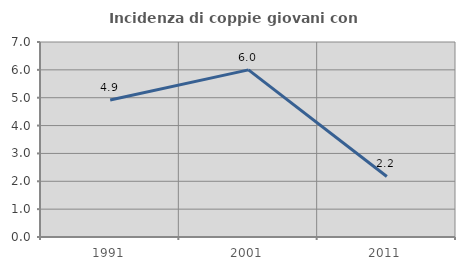
| Category | Incidenza di coppie giovani con figli |
|---|---|
| 1991.0 | 4.918 |
| 2001.0 | 6 |
| 2011.0 | 2.174 |